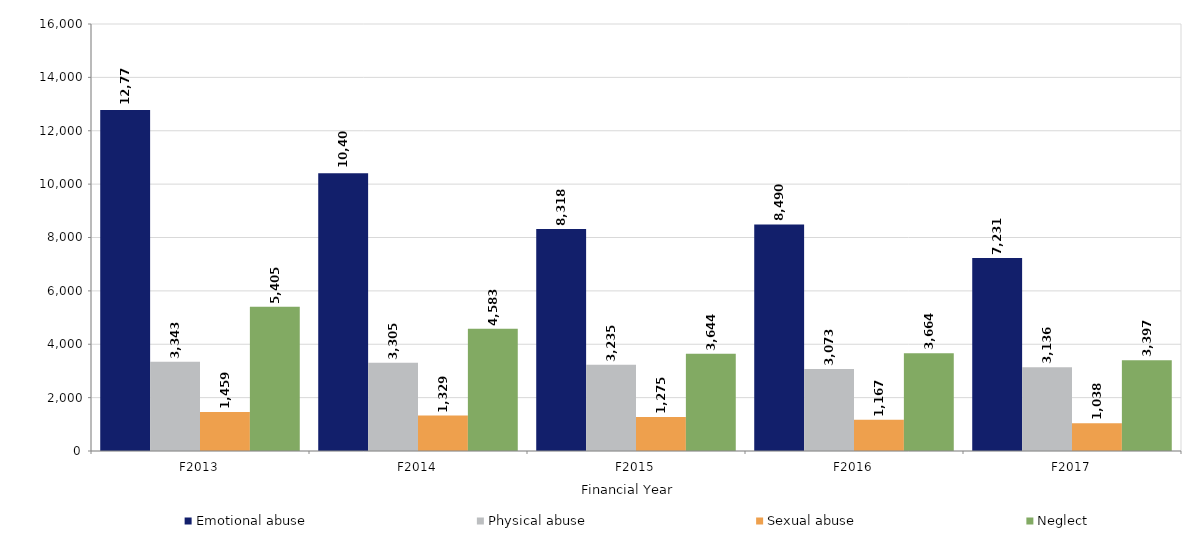
| Category | Emotional abuse | Physical abuse | Sexual abuse | Neglect |
|---|---|---|---|---|
| F2013 | 12777 | 3343 | 1459 | 5405 |
| F2014 | 10406 | 3305 | 1329 | 4583 |
| F2015 | 8318 | 3235 | 1275 | 3644 |
| F2016 | 8490 | 3073 | 1167 | 3664 |
| F2017 | 7231 | 3136 | 1038 | 3397 |